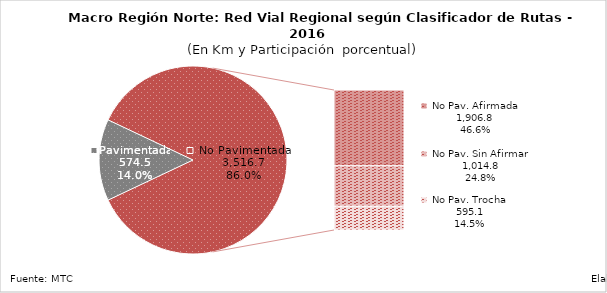
| Category | Series 0 |
|---|---|
| Pavimentada | 574.532 |
| No Pavimentada                   Afirmada | 1906.792 |
| No Pavimentada                   Sin Afirmar | 1014.831 |
| No Pavimentada                            Trocha | 595.064 |